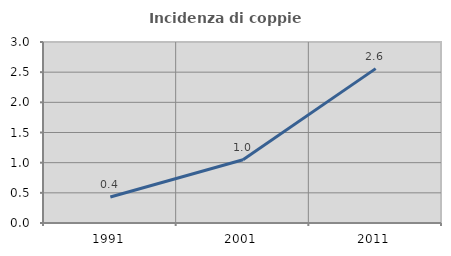
| Category | Incidenza di coppie miste |
|---|---|
| 1991.0 | 0.43 |
| 2001.0 | 1.047 |
| 2011.0 | 2.559 |